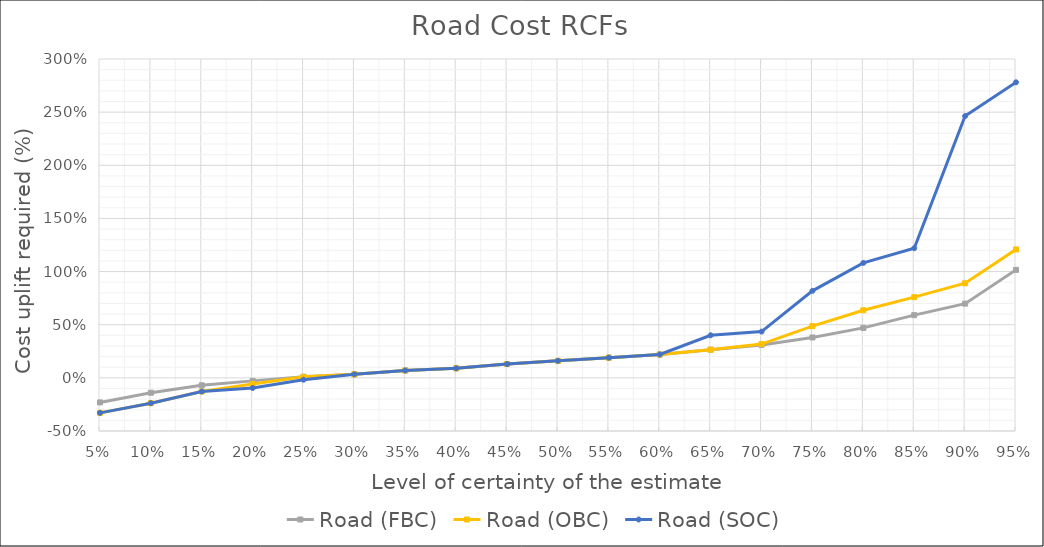
| Category | Road (FBC) | Road (OBC) | Road (SOC) |
|---|---|---|---|
| 0.05 | -0.231 | -0.329 | -0.329 |
| 0.1 | -0.14 | -0.238 | -0.238 |
| 0.15 | -0.07 | -0.128 | -0.128 |
| 0.2 | -0.028 | -0.058 | -0.096 |
| 0.25 | 0.01 | 0.01 | -0.017 |
| 0.3 | 0.034 | 0.034 | 0.034 |
| 0.35 | 0.07 | 0.07 | 0.07 |
| 0.4 | 0.09 | 0.09 | 0.09 |
| 0.45 | 0.13 | 0.13 | 0.13 |
| 0.5 | 0.16 | 0.16 | 0.16 |
| 0.55 | 0.19 | 0.19 | 0.19 |
| 0.6 | 0.22 | 0.22 | 0.22 |
| 0.65 | 0.265 | 0.265 | 0.4 |
| 0.7 | 0.31 | 0.318 | 0.435 |
| 0.75 | 0.38 | 0.486 | 0.819 |
| 0.8 | 0.47 | 0.636 | 1.081 |
| 0.85 | 0.59 | 0.759 | 1.22 |
| 0.9 | 0.698 | 0.89 | 2.463 |
| 0.95 | 1.016 | 1.208 | 2.781 |